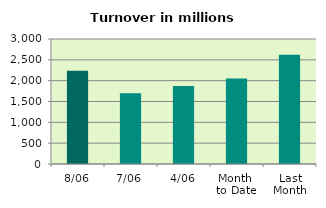
| Category | Series 0 |
|---|---|
| 8/06 | 2240.274 |
| 7/06 | 1699.671 |
| 4/06 | 1871.615 |
| Month 
to Date | 2050.046 |
| Last
Month | 2619.784 |